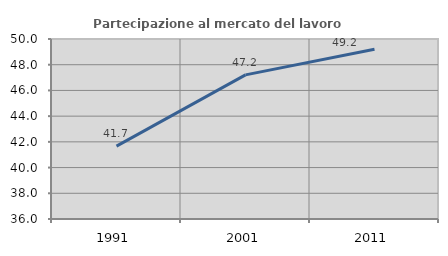
| Category | Partecipazione al mercato del lavoro  femminile |
|---|---|
| 1991.0 | 41.671 |
| 2001.0 | 47.21 |
| 2011.0 | 49.207 |